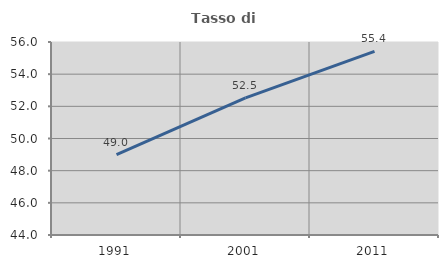
| Category | Tasso di occupazione   |
|---|---|
| 1991.0 | 48.992 |
| 2001.0 | 52.526 |
| 2011.0 | 55.417 |